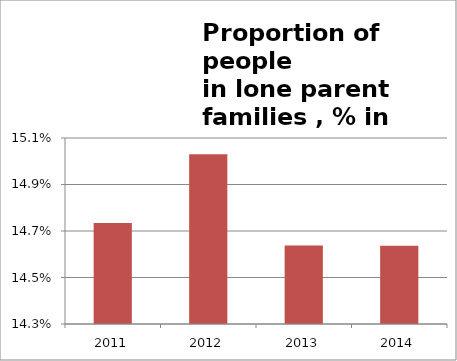
| Category | Series 1 |
|---|---|
| 2011.0 | 0.147 |
| 2012.0 | 0.15 |
| 2013.0 | 0.146 |
| 2014.0 | 0.146 |